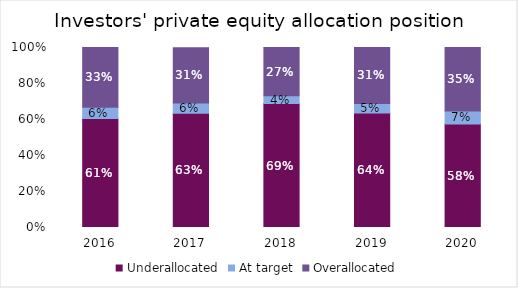
| Category | Underallocated | At target | Overallocated |
|---|---|---|---|
| 2016.0 | 0.605 | 0.062 | 0.332 |
| 2017.0 | 0.634 | 0.057 | 0.307 |
| 2018.0 | 0.689 | 0.044 | 0.268 |
| 2019.0 | 0.636 | 0.053 | 0.311 |
| 2020.0 | 0.575 | 0.072 | 0.353 |